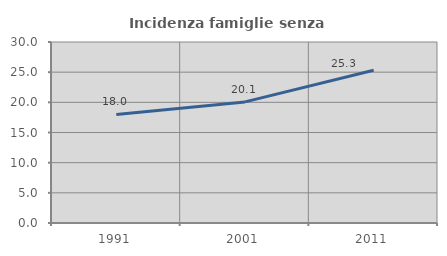
| Category | Incidenza famiglie senza nuclei |
|---|---|
| 1991.0 | 18 |
| 2001.0 | 20.073 |
| 2011.0 | 25.321 |